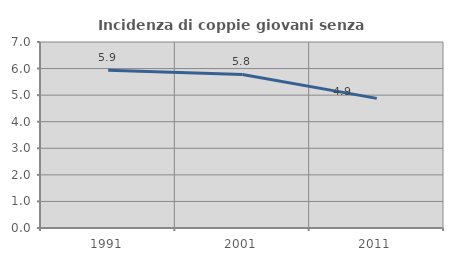
| Category | Incidenza di coppie giovani senza figli |
|---|---|
| 1991.0 | 5.932 |
| 2001.0 | 5.778 |
| 2011.0 | 4.878 |